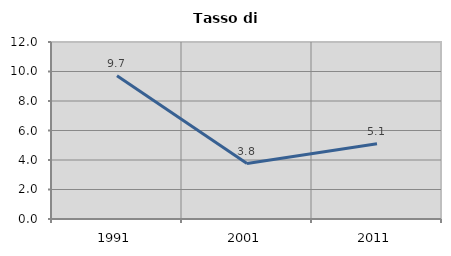
| Category | Tasso di disoccupazione   |
|---|---|
| 1991.0 | 9.709 |
| 2001.0 | 3.759 |
| 2011.0 | 5.096 |